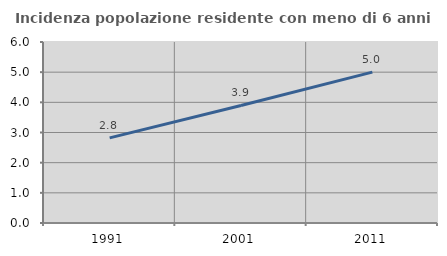
| Category | Incidenza popolazione residente con meno di 6 anni |
|---|---|
| 1991.0 | 2.823 |
| 2001.0 | 3.896 |
| 2011.0 | 5 |